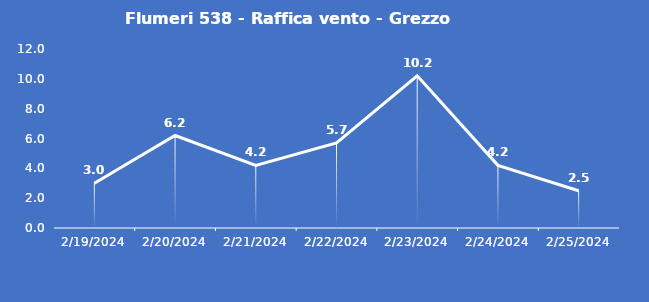
| Category | Flumeri 538 - Raffica vento - Grezzo (m/s) |
|---|---|
| 2/19/24 | 3 |
| 2/20/24 | 6.2 |
| 2/21/24 | 4.2 |
| 2/22/24 | 5.7 |
| 2/23/24 | 10.2 |
| 2/24/24 | 4.2 |
| 2/25/24 | 2.5 |